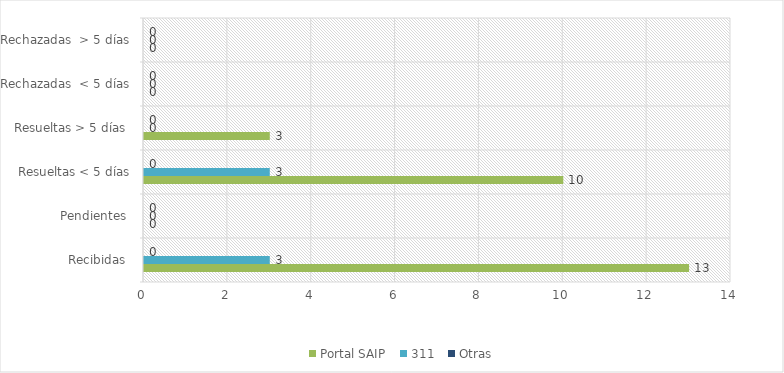
| Category | Portal SAIP | 311 | Otras |
|---|---|---|---|
| Recibidas  | 13 | 3 | 0 |
| Pendientes  | 0 | 0 | 0 |
| Resueltas < 5 días | 10 | 3 | 0 |
| Resueltas > 5 días  | 3 | 0 | 0 |
| Rechazadas  < 5 días | 0 | 0 | 0 |
| Rechazadas  > 5 días | 0 | 0 | 0 |